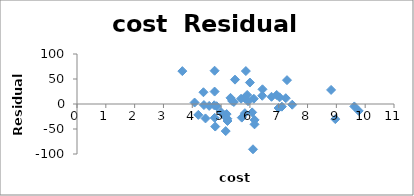
| Category | Series 0 |
|---|---|
| 4.405 | -2.068 |
| 8.963 | -30.212 |
| 4.778 | -27.625 |
| 4.459 | -28.86 |
| 4.992 | -15.848 |
| 5.443 | 4.03 |
| 8.817 | 28.164 |
| 7.03 | 13.32 |
| 5.718 | -27.227 |
| 5.193 | -20.17 |
| 6.078 | -16.755 |
| 4.21 | -21.751 |
| 6.136 | 10.519 |
| 5.826 | -18.337 |
| 5.483 | 48.733 |
| 5.817 | 12.179 |
| 5.217 | -29.526 |
| 4.761 | -2.531 |
| 6.428 | 16.495 |
| 7.245 | 11.596 |
| 7.287 | 47.688 |
| 6.994 | -8.007 |
| 6.0 | 42.937 |
| 4.08 | 2.937 |
| 5.383 | 6.237 |
| 5.692 | 10.549 |
| 5.935 | 5.587 |
| 5.16 | -54.149 |
| 5.859 | 65.865 |
| 9.774 | -13.748 |
| 4.586 | -3.82 |
| 9.623 | -4.88 |
| 5.077 | -21.083 |
| 4.775 | 66.571 |
| 6.162 | -31.783 |
| 4.845 | -4.42 |
| 6.436 | 29.408 |
| 7.109 | -5.312 |
| 7.469 | -1.424 |
| 4.797 | -45.076 |
| 4.775 | 24.855 |
| 4.388 | 23.516 |
| 5.222 | -34.005 |
| 3.656 | 65.766 |
| 6.75 | 14.433 |
| 5.327 | 12.293 |
| 5.906 | 18.085 |
| 6.107 | -90.531 |
| 6.93 | 18.043 |
| 6.16 | -40.657 |